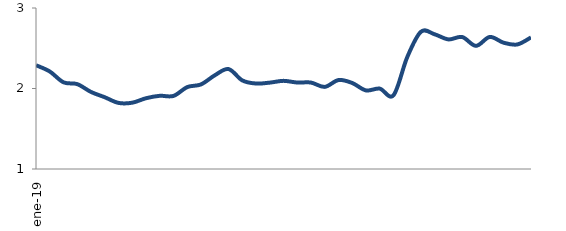
| Category | Series 0 |
|---|---|
| 2019-01-01 | 2.289 |
| 2019-02-01 | 2.212 |
| 2019-03-01 | 2.077 |
| 2019-04-01 | 2.054 |
| 2019-05-01 | 1.957 |
| 2019-06-01 | 1.891 |
| 2019-07-01 | 1.821 |
| 2019-08-01 | 1.823 |
| 2019-09-01 | 1.879 |
| 2019-10-01 | 1.909 |
| 2019-11-01 | 1.908 |
| 2019-12-01 | 2.018 |
| 2020-01-01 | 2.051 |
| 2020-02-01 | 2.164 |
| 2020-03-01 | 2.242 |
| 2020-04-01 | 2.101 |
| 2020-05-01 | 2.062 |
| 2020-06-01 | 2.073 |
| 2020-07-01 | 2.095 |
| 2020-08-01 | 2.074 |
| 2020-09-01 | 2.074 |
| 2020-10-01 | 2.02 |
| 2020-11-01 | 2.105 |
| 2020-12-01 | 2.068 |
| 2021-01-01 | 1.976 |
| 2021-02-01 | 1.998 |
| 2021-03-01 | 1.916 |
| 2021-04-01 | 2.39 |
| 2021-05-01 | 2.706 |
| 2021-06-01 | 2.673 |
| 2021-07-01 | 2.61 |
| 2021-08-01 | 2.639 |
| 2021-09-01 | 2.53 |
| 2021-10-01 | 2.64 |
| 2021-11-01 | 2.569 |
| 2021-12-01 | 2.547 |
| 2022-01-01 | 2.635 |